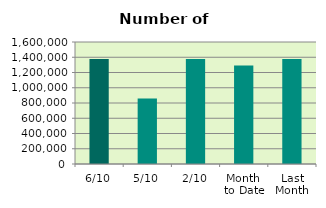
| Category | Series 0 |
|---|---|
| 6/10 | 1376632 |
| 5/10 | 858586 |
| 2/10 | 1378116 |
| Month 
to Date | 1290724.5 |
| Last
Month | 1376245.636 |